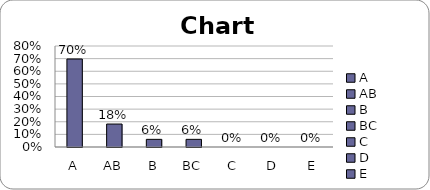
| Category | Series 0 |
|---|---|
| A | 0.697 |
| AB | 0.182 |
| B | 0.061 |
| BC | 0.061 |
| C | 0 |
| D | 0 |
| E | 0 |